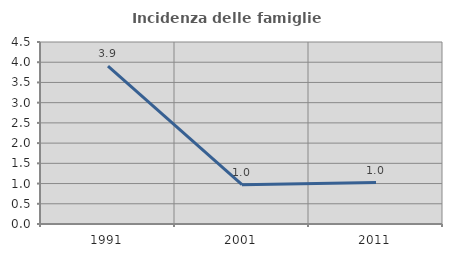
| Category | Incidenza delle famiglie numerose |
|---|---|
| 1991.0 | 3.902 |
| 2001.0 | 0.971 |
| 2011.0 | 1.026 |